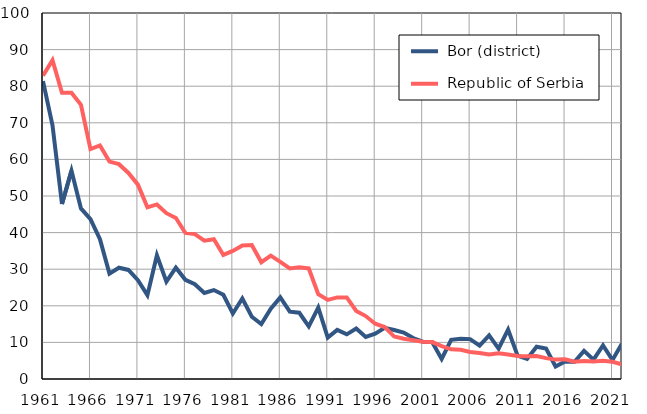
| Category |  Bor (district) |  Republic of Serbia |
|---|---|---|
| 1961.0 | 81.4 | 82.9 |
| 1962.0 | 69.3 | 87.1 |
| 1963.0 | 47.8 | 78.2 |
| 1964.0 | 56.9 | 78.2 |
| 1965.0 | 46.6 | 74.9 |
| 1966.0 | 43.7 | 62.8 |
| 1967.0 | 38.2 | 63.8 |
| 1968.0 | 28.8 | 59.4 |
| 1969.0 | 30.4 | 58.7 |
| 1970.0 | 29.8 | 56.3 |
| 1971.0 | 27 | 53.1 |
| 1972.0 | 22.9 | 46.9 |
| 1973.0 | 33.8 | 47.7 |
| 1974.0 | 26.6 | 45.3 |
| 1975.0 | 30.4 | 44 |
| 1976.0 | 27.1 | 39.9 |
| 1977.0 | 25.9 | 39.6 |
| 1978.0 | 23.5 | 37.8 |
| 1979.0 | 24.3 | 38.2 |
| 1980.0 | 23 | 33.9 |
| 1981.0 | 17.9 | 35 |
| 1982.0 | 22 | 36.5 |
| 1983.0 | 17 | 36.6 |
| 1984.0 | 15 | 31.9 |
| 1985.0 | 19.2 | 33.7 |
| 1986.0 | 22.3 | 32 |
| 1987.0 | 18.4 | 30.2 |
| 1988.0 | 18.1 | 30.5 |
| 1989.0 | 14.4 | 30.2 |
| 1990.0 | 19.5 | 23.2 |
| 1991.0 | 11.3 | 21.6 |
| 1992.0 | 13.4 | 22.3 |
| 1993.0 | 12.2 | 22.3 |
| 1994.0 | 13.8 | 18.6 |
| 1995.0 | 11.5 | 17.2 |
| 1996.0 | 12.4 | 15.1 |
| 1997.0 | 14 | 14.2 |
| 1998.0 | 13.4 | 11.6 |
| 1999.0 | 12.7 | 11 |
| 2000.0 | 11.2 | 10.6 |
| 2001.0 | 10.2 | 10.2 |
| 2002.0 | 10.1 | 10.1 |
| 2003.0 | 5.5 | 9 |
| 2004.0 | 10.7 | 8.1 |
| 2005.0 | 11 | 8 |
| 2006.0 | 10.9 | 7.4 |
| 2007.0 | 9.1 | 7.1 |
| 2008.0 | 11.9 | 6.7 |
| 2009.0 | 8.3 | 7 |
| 2010.0 | 13.5 | 6.7 |
| 2011.0 | 6.4 | 6.3 |
| 2012.0 | 5.5 | 6.2 |
| 2013.0 | 8.8 | 6.3 |
| 2014.0 | 8.3 | 5.7 |
| 2015.0 | 3.4 | 5.3 |
| 2016.0 | 4.8 | 5.4 |
| 2017.0 | 4.7 | 4.7 |
| 2018.0 | 7.7 | 4.9 |
| 2019.0 | 5.3 | 4.8 |
| 2020.0 | 9.2 | 5 |
| 2021.0 | 5.2 | 4.7 |
| 2022.0 | 9.7 | 4 |